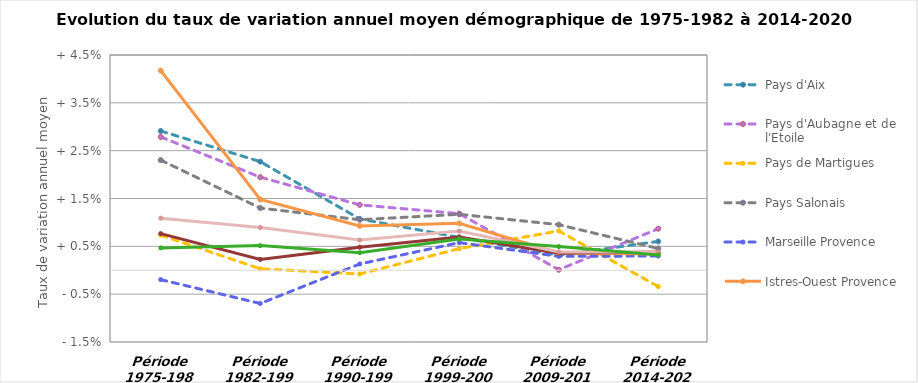
| Category | Pays d'Aix | Pays d'Aubagne et de l'Etoile | Pays de Martigues | Pays Salonais | Marseille Provence | Istres-Ouest Provence | Total Métropole Aix-Marseille Provence | Région Provence-Alpes-Côte-d'Azur | France métropolitaine |
|---|---|---|---|---|---|---|---|---|---|
| Période 1975-1982 | 0.029 | 0.028 | 0.007 | 0.023 | -0.002 | 0.042 | 0.008 | 0.011 | 0.005 |
| Période 1982-1990 | 0.023 | 0.019 | 0 | 0.013 | -0.007 | 0.015 | 0.002 | 0.009 | 0.005 |
| Période 1990-1999 | 0.011 | 0.014 | -0.001 | 0.011 | 0.001 | 0.009 | 0.005 | 0.006 | 0.004 |
| Période 1999-2009 | 0.007 | 0.012 | 0.005 | 0.012 | 0.006 | 0.01 | 0.007 | 0.008 | 0.007 |
| Période 2009-2014 | 0.003 | 0 | 0.008 | 0.01 | 0.003 | 0.004 | 0.004 | 0.004 | 0.005 |
| Période 2014-2020 | 0.006 | 0.009 | -0.003 | 0.005 | 0.003 | 0.003 | 0.004 | 0.004 | 0.003 |